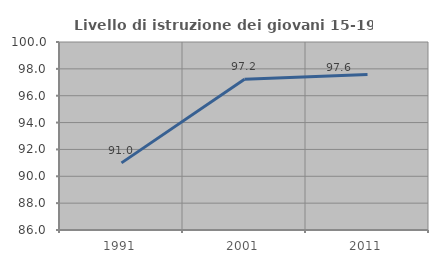
| Category | Livello di istruzione dei giovani 15-19 anni |
|---|---|
| 1991.0 | 90.998 |
| 2001.0 | 97.222 |
| 2011.0 | 97.578 |